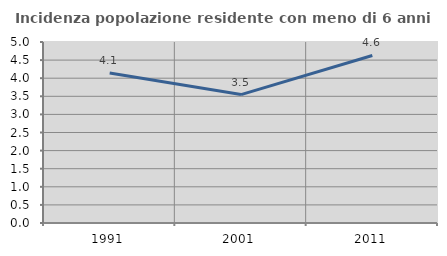
| Category | Incidenza popolazione residente con meno di 6 anni |
|---|---|
| 1991.0 | 4.143 |
| 2001.0 | 3.548 |
| 2011.0 | 4.629 |